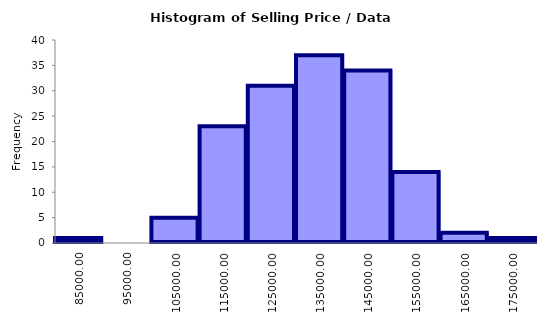
| Category | Series 0 |
|---|---|
| 85000.0 | 1 |
| 95000.0 | 0 |
| 105000.0 | 5 |
| 115000.0 | 23 |
| 125000.0 | 31 |
| 135000.0 | 37 |
| 145000.0 | 34 |
| 155000.0 | 14 |
| 165000.0 | 2 |
| 175000.0 | 1 |